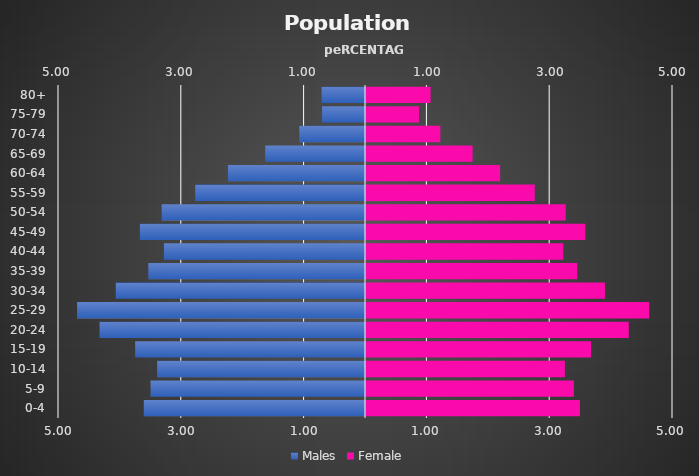
| Category | Males |
|---|---|
| 80+ | 0.707 |
| 75-79 | 0.699 |
| 70-74 | 1.07 |
| 65-69 | 1.625 |
| 60-64 | 2.232 |
| 55-59 | 2.765 |
| 50-54 | 3.312 |
| 45-49 | 3.666 |
| 40-44 | 3.275 |
| 35-39 | 3.529 |
| 30-34 | 4.058 |
| 25-29 | 4.689 |
| 20-24 | 4.323 |
| 15-19 | 3.743 |
| 10-14 | 3.385 |
| 5-9 | 3.492 |
| 0-4 | 3.603 |